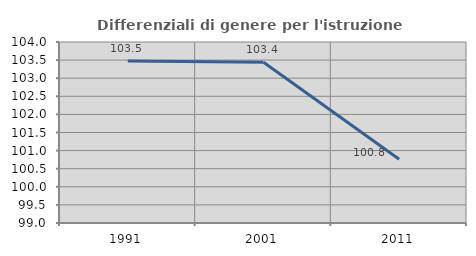
| Category | Differenziali di genere per l'istruzione superiore |
|---|---|
| 1991.0 | 103.477 |
| 2001.0 | 103.441 |
| 2011.0 | 100.76 |